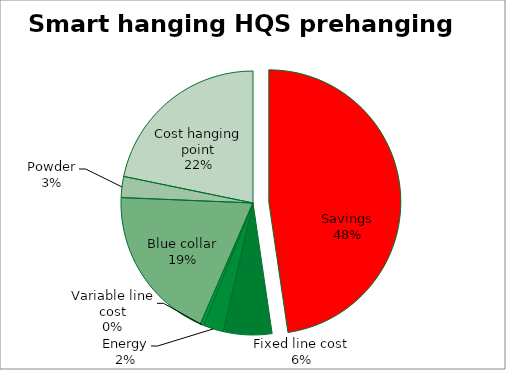
| Category | Savings |
|---|---|
| Savings | 0.477 |
| Fixed line cost | 0.059 |
| Energy | 0.025 |
| Variable line cost | 0.004 |
| Blue collar | 0.191 |
| Powder | 0.026 |
| Cost hanging point | 0.218 |